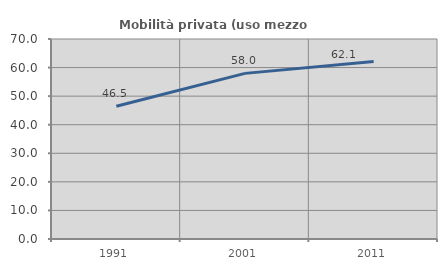
| Category | Mobilità privata (uso mezzo privato) |
|---|---|
| 1991.0 | 46.482 |
| 2001.0 | 57.969 |
| 2011.0 | 62.143 |